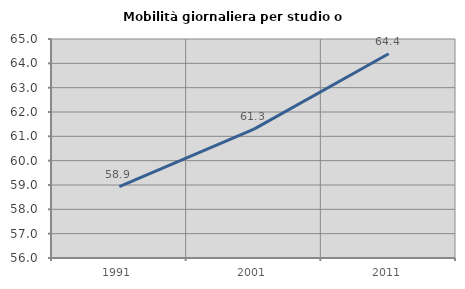
| Category | Mobilità giornaliera per studio o lavoro |
|---|---|
| 1991.0 | 58.938 |
| 2001.0 | 61.295 |
| 2011.0 | 64.393 |